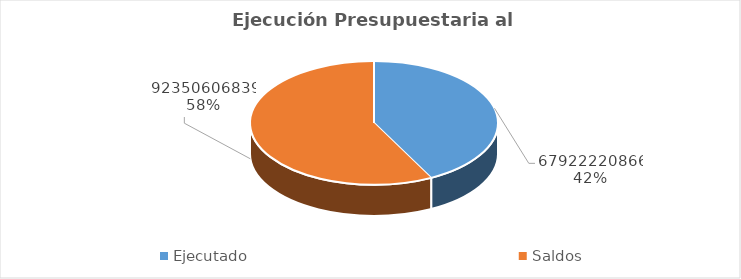
| Category | Series 0 |
|---|---|
| Ejecutado | 67922220866 |
| Saldos | 92350606839 |